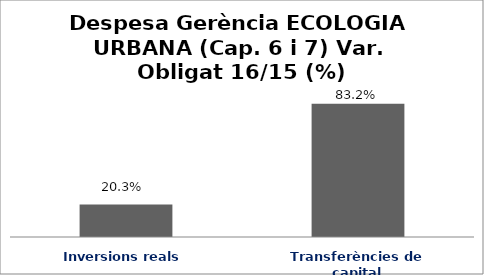
| Category | Series 0 |
|---|---|
| Inversions reals | 0.203 |
| Transferències de capital | 0.832 |